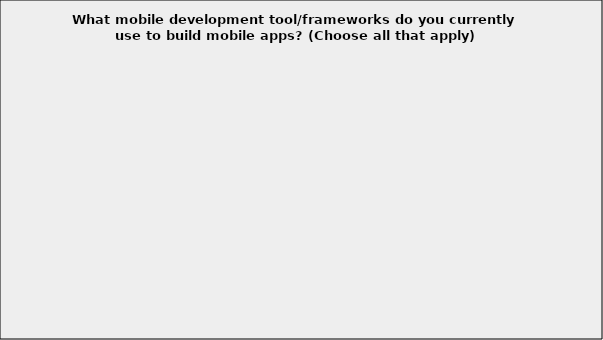
| Category | Series 0 |
|---|---|
| Antenna Software Amp Chroma | 0 |
| Apache Cordova/PhoneGap | 0.112 |
| Appcelerator Titanium | 0.023 |
| Corona SDK | 0.004 |
| Dojo Mobile | 0.021 |
| FeedHenry | 0 |
| Filemaker | 0 |
| IBM Worklight | 0.012 |
| JQuery/JQuery Mobile | 0.244 |
| Kinvey | 0 |
| Kony One | 0.002 |
| Marmalade SDK | 0 |
| Motorola (Rhomobile) Rhodes | 0.002 |
| Parse | 0.002 |
| SAP/Sybase Unwired Platform | 0.021 |
| Sencha Touch | 0.054 |
| Stackmob | 0 |
| Unity | 0.017 |
| Unreal Engine | 0.002 |
| Verivo (Pyxis Mobile) | 0 |
| Xamarin | 0.008 |
| Yahoo Mojito | 0 |
| Native SDKs and development platforms | 0.401 |
| Other (please specify) | 0.076 |
| Don’t know | 0.343 |